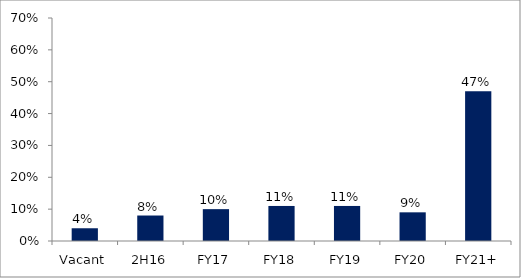
| Category | Series 0 |
|---|---|
| Vacant | 0.04 |
| 2H16 | 0.08 |
| FY17 | 0.1 |
| FY18 | 0.11 |
| FY19 | 0.11 |
| FY20 | 0.09 |
| FY21+ | 0.47 |